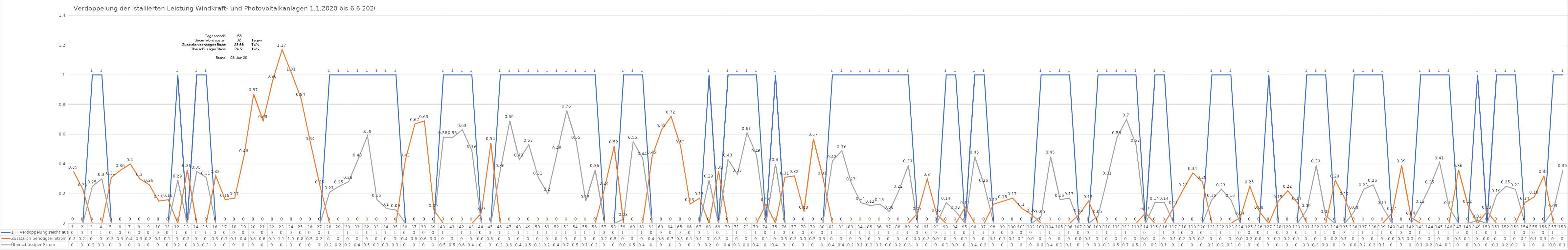
| Category | 1 = Verdoppelung reicht aus | Zusätzlich benötigter Strom | Überschüssiger Strom |
|---|---|---|---|
| 0 | 0 | 0.35 | 0 |
| 1 | 0 | 0.23 | 0 |
| 2 | 1 | 0 | 0.25 |
| 3 | 1 | 0 | 0.3 |
| 4 | 0 | 0.31 | 0 |
| 5 | 0 | 0.36 | 0 |
| 6 | 0 | 0.4 | 0 |
| 7 | 0 | 0.3 | 0 |
| 8 | 0 | 0.26 | 0 |
| 9 | 0 | 0.15 | 0 |
| 10 | 0 | 0.16 | 0 |
| 11 | 1 | 0 | 0.29 |
| 12 | 0 | 0.36 | 0 |
| 13 | 1 | 0 | 0.35 |
| 14 | 1 | 0 | 0.31 |
| 15 | 0 | 0.32 | 0 |
| 16 | 0 | 0.16 | 0 |
| 17 | 0 | 0.17 | 0 |
| 18 | 0 | 0.46 | 0 |
| 19 | 0 | 0.87 | 0 |
| 20 | 0 | 0.69 | 0 |
| 21 | 0 | 0.96 | 0 |
| 22 | 0 | 1.17 | 0 |
| 23 | 0 | 1.01 | 0 |
| 24 | 0 | 0.84 | 0 |
| 25 | 0 | 0.54 | 0 |
| 26 | 0 | 0.25 | 0 |
| 27 | 1 | 0 | 0.21 |
| 28 | 1 | 0 | 0.25 |
| 29 | 1 | 0 | 0.28 |
| 30 | 1 | 0 | 0.43 |
| 31 | 1 | 0 | 0.59 |
| 32 | 1 | 0 | 0.16 |
| 33 | 1 | 0 | 0.1 |
| 34 | 1 | 0 | 0.09 |
| 35 | 0 | 0.43 | 0 |
| 36 | 0 | 0.67 | 0 |
| 37 | 0 | 0.69 | 0 |
| 38 | 0 | 0.09 | 0 |
| 39 | 1 | 0 | 0.58 |
| 40 | 1 | 0 | 0.58 |
| 41 | 1 | 0 | 0.63 |
| 42 | 1 | 0 | 0.49 |
| 43 | 0 | 0.07 | 0 |
| 44 | 0 | 0.54 | 0 |
| 45 | 1 | 0 | 0.36 |
| 46 | 1 | 0 | 0.69 |
| 47 | 1 | 0 | 0.43 |
| 48 | 1 | 0 | 0.53 |
| 49 | 1 | 0 | 0.31 |
| 50 | 1 | 0 | 0.2 |
| 51 | 1 | 0 | 0.48 |
| 52 | 1 | 0 | 0.76 |
| 53 | 1 | 0 | 0.55 |
| 54 | 1 | 0 | 0.15 |
| 55 | 1 | 0 | 0.36 |
| 56 | 0 | 0.24 | 0 |
| 57 | 0 | 0.52 | 0 |
| 58 | 1 | 0 | 0.03 |
| 59 | 1 | 0 | 0.55 |
| 60 | 1 | 0 | 0.44 |
| 61 | 0 | 0.45 | 0 |
| 62 | 0 | 0.63 | 0 |
| 63 | 0 | 0.72 | 0 |
| 64 | 0 | 0.52 | 0 |
| 65 | 0 | 0.13 | 0 |
| 66 | 0 | 0.17 | 0 |
| 67 | 1 | 0 | 0.29 |
| 68 | 0 | 0.35 | 0 |
| 69 | 1 | 0 | 0.43 |
| 70 | 1 | 0 | 0.33 |
| 71 | 1 | 0 | 0.61 |
| 72 | 1 | 0 | 0.46 |
| 73 | 0 | 0.13 | 0 |
| 74 | 1 | 0 | 0.4 |
| 75 | 0 | 0.31 | 0 |
| 76 | 0 | 0.32 | 0 |
| 77 | 0 | 0.08 | 0 |
| 78 | 0 | 0.57 | 0 |
| 79 | 0 | 0.31 | 0 |
| 80 | 1 | 0 | 0.42 |
| 81 | 1 | 0 | 0.49 |
| 82 | 1 | 0 | 0.27 |
| 83 | 1 | 0 | 0.14 |
| 84 | 1 | 0 | 0.12 |
| 85 | 1 | 0 | 0.13 |
| 86 | 1 | 0 | 0.08 |
| 87 | 1 | 0 | 0.22 |
| 88 | 1 | 0 | 0.39 |
| 89 | 0 | 0.07 | 0 |
| 90 | 0 | 0.3 | 0 |
| 91 | 0 | 0.06 | 0 |
| 92 | 1 | 0 | 0.14 |
| 93 | 1 | 0 | 0.08 |
| 94 | 0 | 0.11 | 0 |
| 95 | 1 | 0 | 0.45 |
| 96 | 1 | 0 | 0.26 |
| 97 | 0 | 0.13 | 0 |
| 98 | 0 | 0.15 | 0 |
| 99 | 0 | 0.17 | 0 |
| 100 | 0 | 0.1 | 0 |
| 101 | 0 | 0.06 | 0 |
| 102 | 1 | 0 | 0.05 |
| 103 | 1 | 0 | 0.45 |
| 104 | 1 | 0 | 0.16 |
| 105 | 1 | 0 | 0.17 |
| 106 | 0 | 0.06 | 0 |
| 107 | 0 | 0.15 | 0 |
| 108 | 1 | 0 | 0.05 |
| 109 | 1 | 0 | 0.31 |
| 110 | 1 | 0 | 0.58 |
| 111 | 1 | 0 | 0.7 |
| 112 | 1 | 0 | 0.53 |
| 113 | 0 | 0.07 | 0 |
| 114 | 1 | 0 | 0.14 |
| 115 | 1 | 0 | 0.14 |
| 116 | 0 | 0.11 | 0 |
| 117 | 0 | 0.23 | 0 |
| 118 | 0 | 0.34 | 0 |
| 119 | 0 | 0.28 | 0 |
| 120 | 1 | 0 | 0.16 |
| 121 | 1 | 0 | 0.23 |
| 122 | 1 | 0 | 0.16 |
| 123 | 0 | 0.04 | 0 |
| 124 | 0 | 0.25 | 0 |
| 125 | 0 | 0.08 | 0 |
| 126 | 1 | 0 | 0 |
| 127 | 0 | 0.15 | 0 |
| 128 | 0 | 0.22 | 0 |
| 129 | 0 | 0.14 | 0 |
| 130 | 1 | 0 | 0.09 |
| 131 | 1 | 0 | 0.39 |
| 132 | 1 | 0 | 0.05 |
| 133 | 0 | 0.29 | 0 |
| 134 | 0 | 0.17 | 0 |
| 135 | 1 | 0 | 0.08 |
| 136 | 1 | 0 | 0.23 |
| 137 | 1 | 0 | 0.26 |
| 138 | 1 | 0 | 0.11 |
| 139 | 0 | 0.07 | 0 |
| 140 | 0 | 0.39 | 0 |
| 141 | 0 | 0.04 | 0 |
| 142 | 1 | 0 | 0.12 |
| 143 | 1 | 0 | 0.25 |
| 144 | 1 | 0 | 0.41 |
| 145 | 1 | 0 | 0.11 |
| 146 | 0 | 0.36 | 0 |
| 147 | 0 | 0.12 | 0 |
| 148 | 1 | 0 | 0.02 |
| 149 | 0 | 0.08 | 0 |
| 150 | 1 | 0 | 0.19 |
| 151 | 1 | 0 | 0.25 |
| 152 | 1 | 0 | 0.23 |
| 153 | 0 | 0.14 | 0 |
| 154 | 0 | 0.18 | 0 |
| 155 | 0 | 0.32 | 0 |
| 156 | 1 | 0 | 0.09 |
| 157 | 1 | 0 | 0.36 |